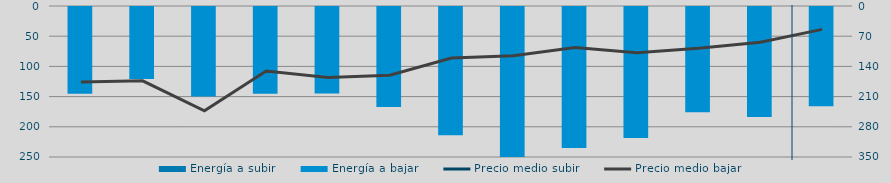
| Category | Energía a subir | Energía a bajar |
|---|---|---|
| E |  | 145.389 |
| F |  | 120.749 |
| M |  | 149.634 |
| A |  | 145.139 |
| M |  | 144.75 |
| J |  | 167.183 |
| J |  | 214.052 |
| A |  | 250.14 |
| S |  | 234.984 |
| O |  | 218.689 |
| N |  | 176.116 |
| D |  | 183.605 |
| E |  | 165.84 |